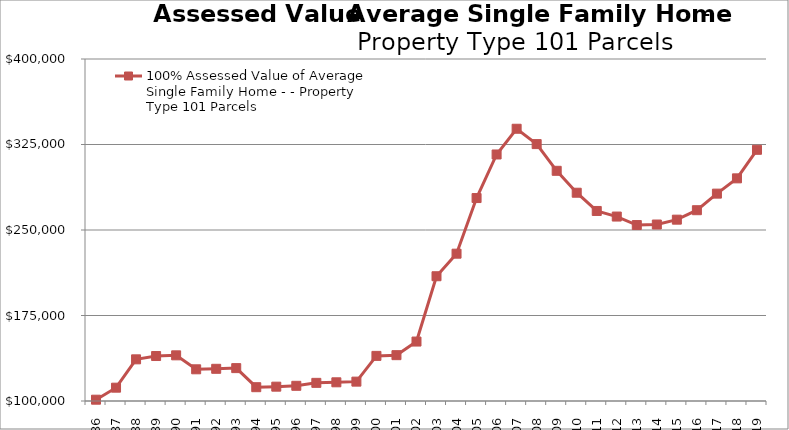
| Category | 100% Assessed Value of Average Single Family Home - - Property Type 101 Parcels |
|---|---|
| 1986.0 | 101147.81 |
| 1987.0 | 111691.111 |
| 1988.0 | 136553 |
| 1989.0 | 139452 |
| 1990.0 | 140053 |
| 1991.0 | 127807 |
| 1992.0 | 128240 |
| 1993.0 | 128846 |
| 1994.0 | 112105 |
| 1995.0 | 112571 |
| 1996.0 | 113334 |
| 1997.0 | 115913 |
| 1998.0 | 116394 |
| 1999.0 | 116989 |
| 2000.0 | 139570 |
| 2001.0 | 140201 |
| 2002.0 | 152147 |
| 2003.0 | 209435 |
| 2004.0 | 229224 |
| 2005.0 | 278029 |
| 2006.0 | 316252 |
| 2007.0 | 338813 |
| 2008.0 | 325343 |
| 2009.0 | 301922 |
| 2010.0 | 282701 |
| 2011.0 | 266699.442 |
| 2012.0 | 261798.823 |
| 2013.0 | 254333.954 |
| 2014.0 | 254800 |
| 2015.0 | 259066 |
| 2016.0 | 267361 |
| 2017.0 | 281895 |
| 2018.0 | 295300 |
| 2019.0 | 320340 |